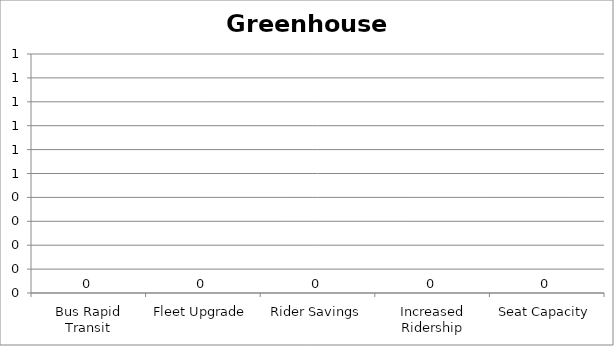
| Category | Greenhouse Gas |
|---|---|
| Bus Rapid Transit | 0 |
| Fleet Upgrade | 0 |
| Rider Savings | 0 |
| Increased Ridership | 0 |
| Seat Capacity | 0 |